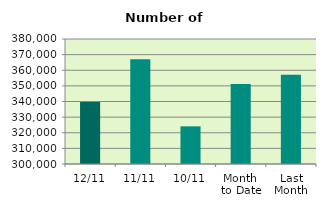
| Category | Series 0 |
|---|---|
| 12/11 | 339756 |
| 11/11 | 366964 |
| 10/11 | 324092 |
| Month 
to Date | 351189.4 |
| Last
Month | 357160.667 |